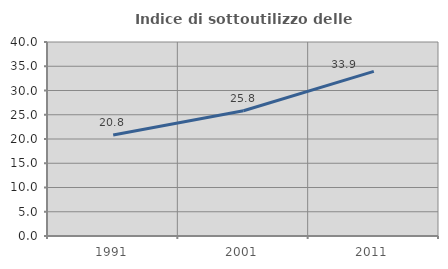
| Category | Indice di sottoutilizzo delle abitazioni  |
|---|---|
| 1991.0 | 20.807 |
| 2001.0 | 25.835 |
| 2011.0 | 33.933 |